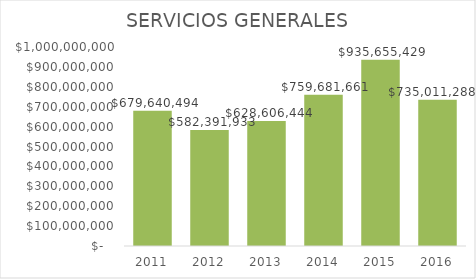
| Category | SERVICIOS GENERALES |
|---|---|
| 2011.0 | 679640494 |
| 2012.0 | 582391933 |
| 2013.0 | 628606444 |
| 2014.0 | 759681661.469 |
| 2015.0 | 935655429 |
| 2016.0 | 735011288.02 |